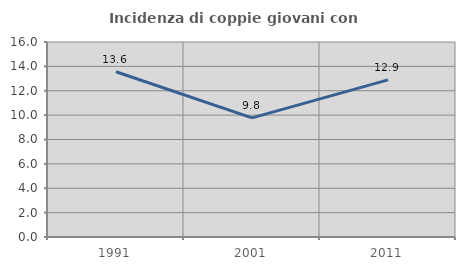
| Category | Incidenza di coppie giovani con figli |
|---|---|
| 1991.0 | 13.559 |
| 2001.0 | 9.778 |
| 2011.0 | 12.892 |